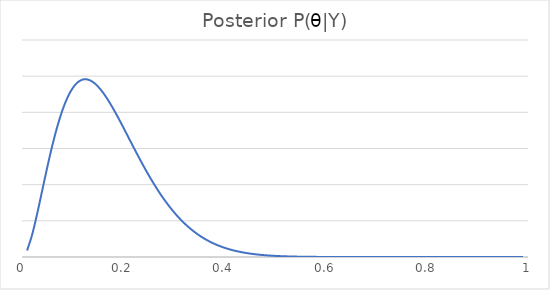
| Category | Series 0 |
|---|---|
| 0.01 | 0.177 |
| 0.02 | 0.615 |
| 0.03 | 1.199 |
| 0.04 | 1.843 |
| 0.05 | 2.487 |
| 0.06 | 3.088 |
| 0.07 | 3.619 |
| 0.08 | 4.063 |
| 0.09 | 4.413 |
| 0.1 | 4.667 |
| 0.11 | 4.829 |
| 0.12 | 4.906 |
| 0.13 | 4.907 |
| 0.14 | 4.84 |
| 0.15 | 4.717 |
| 0.16 | 4.548 |
| 0.17 | 4.341 |
| 0.18 | 4.107 |
| 0.19 | 3.854 |
| 0.2 | 3.589 |
| 0.21 | 3.318 |
| 0.22 | 3.046 |
| 0.23 | 2.779 |
| 0.24 | 2.52 |
| 0.25 | 2.272 |
| 0.26 | 2.036 |
| 0.27 | 1.815 |
| 0.28 | 1.609 |
| 0.29 | 1.419 |
| 0.3 | 1.245 |
| 0.31 | 1.087 |
| 0.32 | 0.944 |
| 0.33 | 0.816 |
| 0.34 | 0.702 |
| 0.35 | 0.601 |
| 0.36 | 0.511 |
| 0.37 | 0.433 |
| 0.38 | 0.365 |
| 0.39 | 0.306 |
| 0.4 | 0.256 |
| 0.41 | 0.212 |
| 0.42 | 0.175 |
| 0.43 | 0.144 |
| 0.44 | 0.118 |
| 0.45 | 0.096 |
| 0.46 | 0.077 |
| 0.47 | 0.062 |
| 0.48 | 0.05 |
| 0.49 | 0.039 |
| 0.5 | 0.031 |
| 0.51 | 0.024 |
| 0.52 | 0.019 |
| 0.53 | 0.015 |
| 0.54 | 0.011 |
| 0.55 | 0.009 |
| 0.56 | 0.007 |
| 0.57 | 0.005 |
| 0.58 | 0.004 |
| 0.59 | 0.003 |
| 0.6 | 0.002 |
| 0.61 | 0.001 |
| 0.62 | 0.001 |
| 0.63 | 0.001 |
| 0.64 | 0.001 |
| 0.65 | 0 |
| 0.66 | 0 |
| 0.67 | 0 |
| 0.68 | 0 |
| 0.69 | 0 |
| 0.7 | 0 |
| 0.71 | 0 |
| 0.72 | 0 |
| 0.73 | 0 |
| 0.74 | 0 |
| 0.75 | 0 |
| 0.76 | 0 |
| 0.77 | 0 |
| 0.78 | 0 |
| 0.79 | 0 |
| 0.8 | 0 |
| 0.81 | 0 |
| 0.82 | 0 |
| 0.83 | 0 |
| 0.84 | 0 |
| 0.85 | 0 |
| 0.86 | 0 |
| 0.87 | 0 |
| 0.88 | 0 |
| 0.89 | 0 |
| 0.9 | 0 |
| 0.91 | 0 |
| 0.92 | 0 |
| 0.93 | 0 |
| 0.94 | 0 |
| 0.95 | 0 |
| 0.96 | 0 |
| 0.97 | 0 |
| 0.98 | 0 |
| 0.99 | 0 |